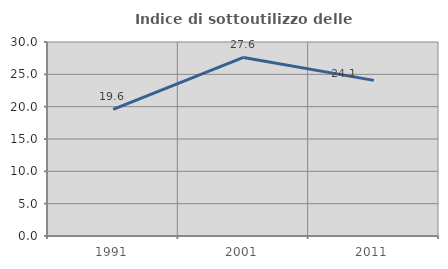
| Category | Indice di sottoutilizzo delle abitazioni  |
|---|---|
| 1991.0 | 19.591 |
| 2001.0 | 27.616 |
| 2011.0 | 24.069 |